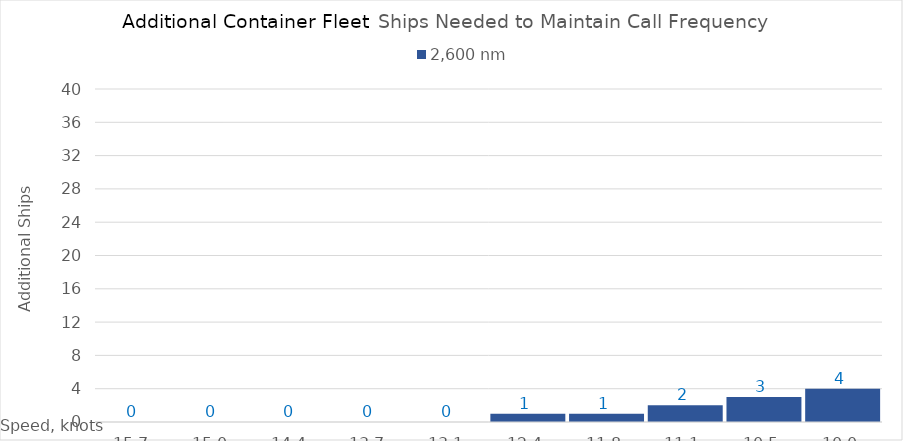
| Category | 2,600 |
|---|---|
| 15.65 | 0 |
| 15.0 | 0 |
| 14.35 | 0 |
| 13.7 | 0 |
| 13.049999999999999 | 0 |
| 12.399999999999999 | 1 |
| 11.749999999999998 | 1 |
| 11.099999999999998 | 2 |
| 10.449999999999998 | 3 |
| 10.0 | 4 |